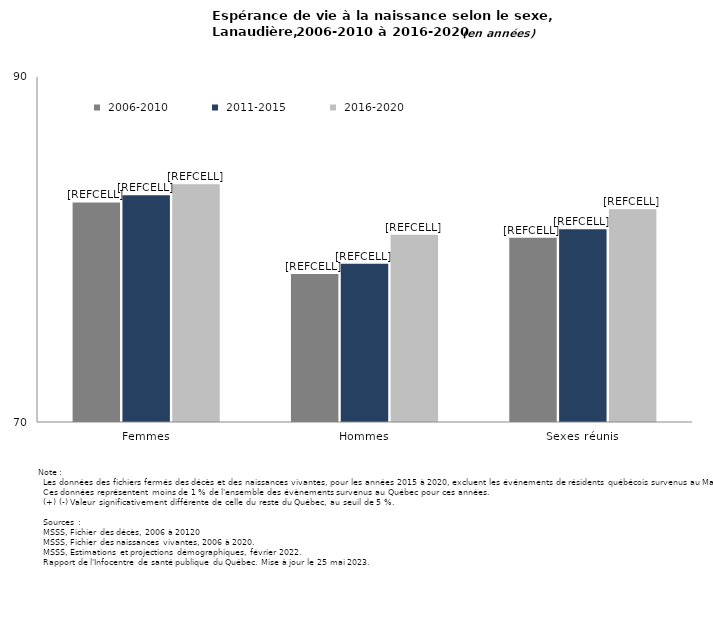
| Category |  2006-2010 |  2011-2015 |  2016-2020 |
|---|---|---|---|
| Femmes | 82.728 | 83.144 | 83.784 |
| Hommes | 78.579 | 79.171 | 80.849 |
| Sexes réunis | 80.679 | 81.181 | 82.335 |